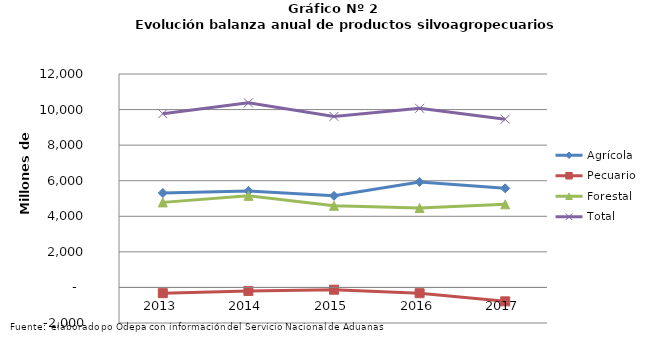
| Category | Agrícola | Pecuario | Forestal | Total |
|---|---|---|---|---|
| 2013.0 | 5309603 | -322473 | 4781973 | 9769103 |
| 2014.0 | 5424524 | -195643 | 5149868 | 10378749 |
| 2015.0 | 5149872 | -127785 | 4591408 | 9613495 |
| 2016.0 | 5928552 | -325380 | 4468104 | 10071276 |
| 2017.0 | 5570699 | -782581 | 4672209 | 9460327 |